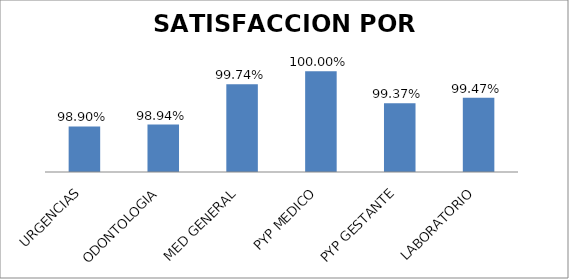
| Category | N° ENCUESTAS |
|---|---|
| URGENCIAS | 0.989 |
| ODONTOLOGIA | 0.989 |
| MED GENERAL | 0.997 |
| PYP MEDICO | 1 |
| PYP GESTANTE | 0.994 |
| LABORATORIO | 0.995 |